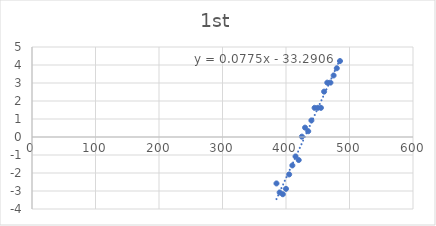
| Category | Series 0 |
|---|---|
| 385.0 | -2.58 |
| 390.0 | -3.08 |
| 395.0 | -3.18 |
| 400.0 | -2.88 |
| 405.0 | -2.08 |
| 410.0 | -1.58 |
| 415.0 | -1.08 |
| 420.0 | -1.28 |
| 425.0 | 0.02 |
| 430.0 | 0.52 |
| 435.0 | 0.32 |
| 440.0 | 0.92 |
| 445.0 | 1.62 |
| 450.0 | 1.62 |
| 455.0 | 1.62 |
| 460.0 | 2.52 |
| 465.0 | 3.02 |
| 470.0 | 3.02 |
| 475.0 | 3.42 |
| 480.0 | 3.82 |
| 485.0 | 4.22 |